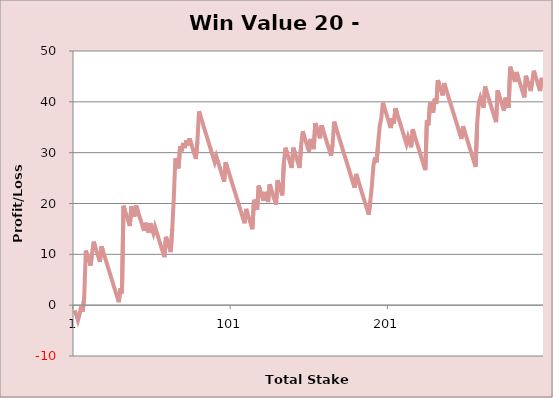
| Category | Series 0 |
|---|---|
| 0 | -1 |
| 1 | -2 |
| 2 | -3 |
| 3 | -1.85 |
| 4 | -0.25 |
| 5 | -1.25 |
| 6 | 1.5 |
| 7 | 10.75 |
| 8 | 9.75 |
| 9 | 8.75 |
| 10 | 7.75 |
| 11 | 10.19 |
| 12 | 12.5 |
| 13 | 11.5 |
| 14 | 10.5 |
| 15 | 9.5 |
| 16 | 8.5 |
| 17 | 11.58 |
| 18 | 10.58 |
| 19 | 9.58 |
| 20 | 8.58 |
| 21 | 7.58 |
| 22 | 6.58 |
| 23 | 5.58 |
| 24 | 4.58 |
| 25 | 3.58 |
| 26 | 2.58 |
| 27 | 1.58 |
| 28 | 0.58 |
| 29 | 3.31 |
| 30 | 2.31 |
| 31 | 19.56 |
| 32 | 18.56 |
| 33 | 17.56 |
| 34 | 16.56 |
| 35 | 15.56 |
| 36 | 19.42 |
| 37 | 18.42 |
| 38 | 17.42 |
| 39 | 19.62 |
| 40 | 18.62 |
| 41 | 17.62 |
| 42 | 16.62 |
| 43 | 15.62 |
| 44 | 14.62 |
| 45 | 16.22 |
| 46 | 15.22 |
| 47 | 14.22 |
| 48 | 16.12 |
| 49 | 15.12 |
| 50 | 14.12 |
| 51 | 15.45 |
| 52 | 14.45 |
| 53 | 13.45 |
| 54 | 12.45 |
| 55 | 11.45 |
| 56 | 10.45 |
| 57 | 9.45 |
| 58 | 13.45 |
| 59 | 12.45 |
| 60 | 11.45 |
| 61 | 10.45 |
| 62 | 14.95 |
| 63 | 21.13 |
| 64 | 28.89 |
| 65 | 27.89 |
| 66 | 26.89 |
| 67 | 31.27 |
| 68 | 30.27 |
| 69 | 31.91 |
| 70 | 30.91 |
| 71 | 32.42 |
| 72 | 31.42 |
| 73 | 32.81 |
| 74 | 31.81 |
| 75 | 30.81 |
| 76 | 29.81 |
| 77 | 28.81 |
| 78 | 32.14 |
| 79 | 38.14 |
| 80 | 37.14 |
| 81 | 36.14 |
| 82 | 35.14 |
| 83 | 34.14 |
| 84 | 33.14 |
| 85 | 32.14 |
| 86 | 31.14 |
| 87 | 30.14 |
| 88 | 29.14 |
| 89 | 28.14 |
| 90 | 29.31 |
| 91 | 28.31 |
| 92 | 27.31 |
| 93 | 26.31 |
| 94 | 25.31 |
| 95 | 24.31 |
| 96 | 28.11 |
| 97 | 27.11 |
| 98 | 26.11 |
| 99 | 25.11 |
| 100 | 24.11 |
| 101 | 23.11 |
| 102 | 22.11 |
| 103 | 21.11 |
| 104 | 20.11 |
| 105 | 19.11 |
| 106 | 18.11 |
| 107 | 17.11 |
| 108 | 16.11 |
| 109 | 18.94 |
| 110 | 17.94 |
| 111 | 16.94 |
| 112 | 15.94 |
| 113 | 14.94 |
| 114 | 20.74 |
| 115 | 19.74 |
| 116 | 18.74 |
| 117 | 23.53 |
| 118 | 22.53 |
| 119 | 21.53 |
| 120 | 20.53 |
| 121 | 22.28 |
| 122 | 21.28 |
| 123 | 20.28 |
| 124 | 23.78 |
| 125 | 22.78 |
| 126 | 21.78 |
| 127 | 20.78 |
| 128 | 19.78 |
| 129 | 24.6 |
| 130 | 23.6 |
| 131 | 22.6 |
| 132 | 21.6 |
| 133 | 27.87 |
| 134 | 30.98 |
| 135 | 29.98 |
| 136 | 28.98 |
| 137 | 27.98 |
| 138 | 26.98 |
| 139 | 30.98 |
| 140 | 29.98 |
| 141 | 28.98 |
| 142 | 27.98 |
| 143 | 26.98 |
| 144 | 31.44 |
| 145 | 34.19 |
| 146 | 33.19 |
| 147 | 32.19 |
| 148 | 31.19 |
| 149 | 30.19 |
| 150 | 32.69 |
| 151 | 31.69 |
| 152 | 30.69 |
| 153 | 35.81 |
| 154 | 34.81 |
| 155 | 33.81 |
| 156 | 32.81 |
| 157 | 35.4 |
| 158 | 34.4 |
| 159 | 33.4 |
| 160 | 32.4 |
| 161 | 31.4 |
| 162 | 30.4 |
| 163 | 29.4 |
| 164 | 31.6 |
| 165 | 36.1 |
| 166 | 35.1 |
| 167 | 34.1 |
| 168 | 33.1 |
| 169 | 32.1 |
| 170 | 31.1 |
| 171 | 30.1 |
| 172 | 29.1 |
| 173 | 28.1 |
| 174 | 27.1 |
| 175 | 26.1 |
| 176 | 25.1 |
| 177 | 24.1 |
| 178 | 23.1 |
| 179 | 25.82 |
| 180 | 24.82 |
| 181 | 23.82 |
| 182 | 22.82 |
| 183 | 21.82 |
| 184 | 20.82 |
| 185 | 19.82 |
| 186 | 18.82 |
| 187 | 17.82 |
| 188 | 20.47 |
| 189 | 23.47 |
| 190 | 27.47 |
| 191 | 29.09 |
| 192 | 28.09 |
| 193 | 31.95 |
| 194 | 35.24 |
| 195 | 36.84 |
| 196 | 39.84 |
| 197 | 38.84 |
| 198 | 37.84 |
| 199 | 36.84 |
| 200 | 35.84 |
| 201 | 34.84 |
| 202 | 36.74 |
| 203 | 35.74 |
| 204 | 38.74 |
| 205 | 37.74 |
| 206 | 36.74 |
| 207 | 35.74 |
| 208 | 34.74 |
| 209 | 33.74 |
| 210 | 32.74 |
| 211 | 31.74 |
| 212 | 33.06 |
| 213 | 32.06 |
| 214 | 31.06 |
| 215 | 34.57 |
| 216 | 33.57 |
| 217 | 32.57 |
| 218 | 31.57 |
| 219 | 30.57 |
| 220 | 29.57 |
| 221 | 28.57 |
| 222 | 27.57 |
| 223 | 26.57 |
| 224 | 36.38 |
| 225 | 35.38 |
| 226 | 39.88 |
| 227 | 38.88 |
| 228 | 37.88 |
| 229 | 40.63 |
| 230 | 39.63 |
| 231 | 44.26 |
| 232 | 43.26 |
| 233 | 42.26 |
| 234 | 41.26 |
| 235 | 43.69 |
| 236 | 42.69 |
| 237 | 41.69 |
| 238 | 40.69 |
| 239 | 39.69 |
| 240 | 38.69 |
| 241 | 37.69 |
| 242 | 36.69 |
| 243 | 35.69 |
| 244 | 34.69 |
| 245 | 33.69 |
| 246 | 32.69 |
| 247 | 35.2 |
| 248 | 34.2 |
| 249 | 33.2 |
| 250 | 32.2 |
| 251 | 31.2 |
| 252 | 30.2 |
| 253 | 29.2 |
| 254 | 28.2 |
| 255 | 27.2 |
| 256 | 35.83 |
| 257 | 39.76 |
| 258 | 40.82 |
| 259 | 39.82 |
| 260 | 38.82 |
| 261 | 43 |
| 262 | 42 |
| 263 | 41 |
| 264 | 40 |
| 265 | 39 |
| 266 | 38 |
| 267 | 37 |
| 268 | 36 |
| 269 | 42.26 |
| 270 | 41.26 |
| 271 | 40.26 |
| 272 | 39.26 |
| 273 | 38.26 |
| 274 | 40.82 |
| 275 | 39.82 |
| 276 | 38.82 |
| 277 | 46.91 |
| 278 | 45.91 |
| 279 | 44.91 |
| 280 | 43.91 |
| 281 | 45.87 |
| 282 | 44.87 |
| 283 | 43.87 |
| 284 | 42.87 |
| 285 | 41.87 |
| 286 | 40.87 |
| 287 | 45.13 |
| 288 | 44.13 |
| 289 | 43.13 |
| 290 | 42.13 |
| 291 | 44.02 |
| 292 | 46.12 |
| 293 | 45.12 |
| 294 | 44.12 |
| 295 | 43.12 |
| 296 | 42.12 |
| 297 | 44.71 |
| 298 | 43.71 |